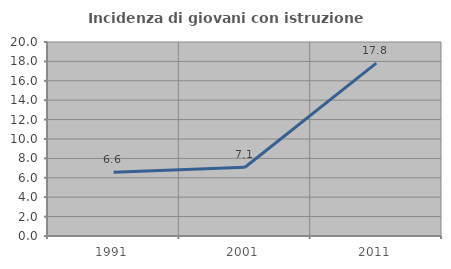
| Category | Incidenza di giovani con istruzione universitaria |
|---|---|
| 1991.0 | 6.572 |
| 2001.0 | 7.087 |
| 2011.0 | 17.827 |